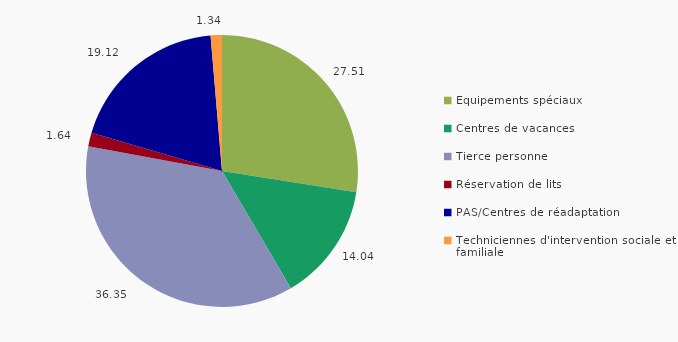
| Category | Dépenses totales |
|---|---|
| Equipements spéciaux | 27.507 |
| Centres de vacances | 14.043 |
| Tierce personne | 36.35 |
| Réservation de lits | 1.641 |
| PAS/Centres de réadaptation | 19.119 |
| Techniciennes d'intervention sociale et familiale | 1.341 |